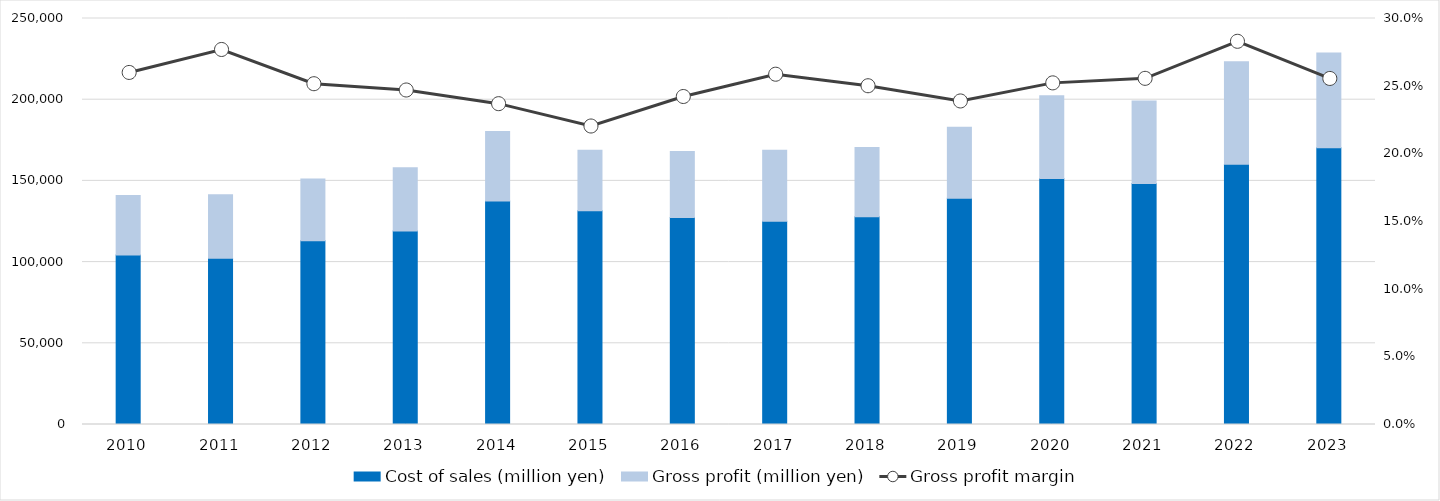
| Category | Cost of sales (million yen) | Gross profit (million yen) |
|---|---|---|
| 2010 | 104325 | 36610 |
| 2011 | 102345 | 39161 |
| 2012 | 113189 | 38020 |
| 2013 | 119121 | 39031 |
| 2014 | 137693 | 42699 |
| 2015 | 131657 | 37175 |
| 2016 | 127452 | 40689 |
| 2017 | 125201 | 43640 |
| 2018 | 127946 | 42635 |
| 2019 | 139289 | 43673 |
| 2020 | 151442 | 51038 |
| 2021 | 148328 | 50881 |
| 2022 | 160210 | 63167 |
| 2023 | 170399 | 58427 |